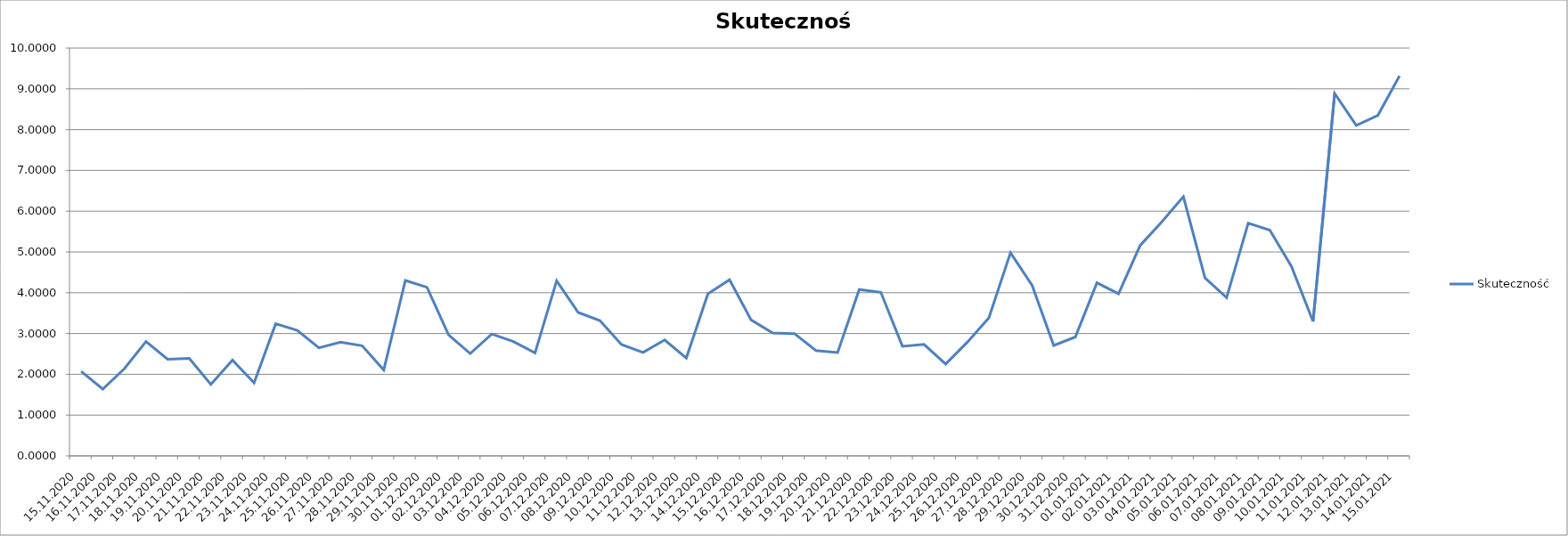
| Category | Skuteczność |
|---|---|
| 15.11.2020 | 2.073 |
| 16.11.2020 | 1.638 |
| 17.11.2020 | 2.138 |
| 18.11.2020 | 2.803 |
| 19.11.2020 | 2.371 |
| 20.11.2020 | 2.39 |
| 21.11.2020 | 1.752 |
| 22.11.2020 | 2.349 |
| 23.11.2020 | 1.791 |
| 24.11.2020 | 3.239 |
| 25.11.2020 | 3.077 |
| 26.11.2020 | 2.648 |
| 27.11.2020 | 2.787 |
| 28.11.2020 | 2.699 |
| 29.11.2020 | 2.104 |
| 30.11.2020 | 4.302 |
| 01.12.2020 | 4.134 |
| 02.12.2020 | 2.966 |
| 03.12.2020 | 2.51 |
| 04.12.2020 | 2.988 |
| 05.12.2020 | 2.803 |
| 06.12.2020 | 2.526 |
| 07.12.2020 | 4.294 |
| 08.12.2020 | 3.515 |
| 09.12.2020 | 3.317 |
| 10.12.2020 | 2.729 |
| 11.12.2020 | 2.535 |
| 12.12.2020 | 2.843 |
| 13.12.2020 | 2.4 |
| 14.12.2020 | 3.974 |
| 15.12.2020 | 4.319 |
| 16.12.2020 | 3.333 |
| 17.12.2020 | 3.013 |
| 18.12.2020 | 2.998 |
| 19.12.2020 | 2.581 |
| 20.12.2020 | 2.533 |
| 21.12.2020 | 4.08 |
| 22.12.2020 | 4.012 |
| 23.12.2020 | 2.688 |
| 24.12.2020 | 2.733 |
| 25.12.2020 | 2.251 |
| 26.12.2020 | 2.786 |
| 27.12.2020 | 3.386 |
| 28.12.2020 | 4.982 |
| 29.12.2020 | 4.184 |
| 30.12.2020 | 2.707 |
| 31.12.2020 | 2.915 |
| 01.01.2021 | 4.245 |
| 02.01.2021 | 3.975 |
| 03.01.2021 | 5.161 |
| 04.01.2021 | 5.739 |
| 05.01.2021 | 6.357 |
| 06.01.2021 | 4.364 |
| 07.01.2021 | 3.879 |
| 08.01.2021 | 5.708 |
| 09.01.2021 | 5.534 |
| 10.01.2021 | 4.647 |
| 11.01.2021 | 3.296 |
| 12.01.2021 | 8.887 |
| 13.01.2021 | 8.105 |
| 14.01.2021 | 8.35 |
| 15.01.2021 | 9.318 |